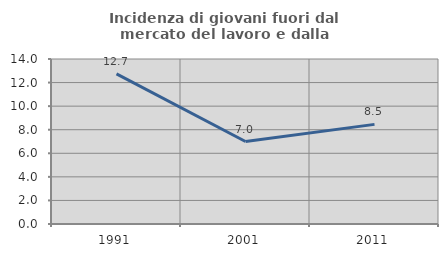
| Category | Incidenza di giovani fuori dal mercato del lavoro e dalla formazione  |
|---|---|
| 1991.0 | 12.736 |
| 2001.0 | 6.998 |
| 2011.0 | 8.453 |